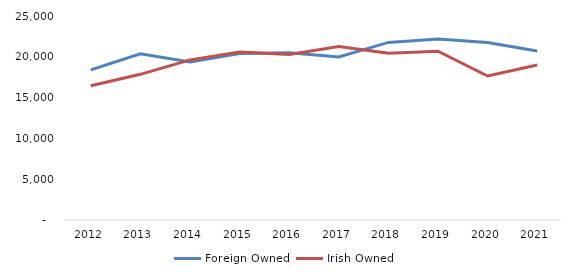
| Category | Foreign Owned | Irish Owned |
|---|---|---|
| 2012.0 | 18391 | 16444 |
| 2013.0 | 20370 | 17852 |
| 2014.0 | 19374 | 19625 |
| 2015.0 | 20415 | 20594 |
| 2016.0 | 20488 | 20282 |
| 2017.0 | 19988 | 21259 |
| 2018.0 | 21764 | 20427 |
| 2019.0 | 22195 | 20681 |
| 2020.0 | 21758 | 17643 |
| 2021.0 | 20701 | 18992 |